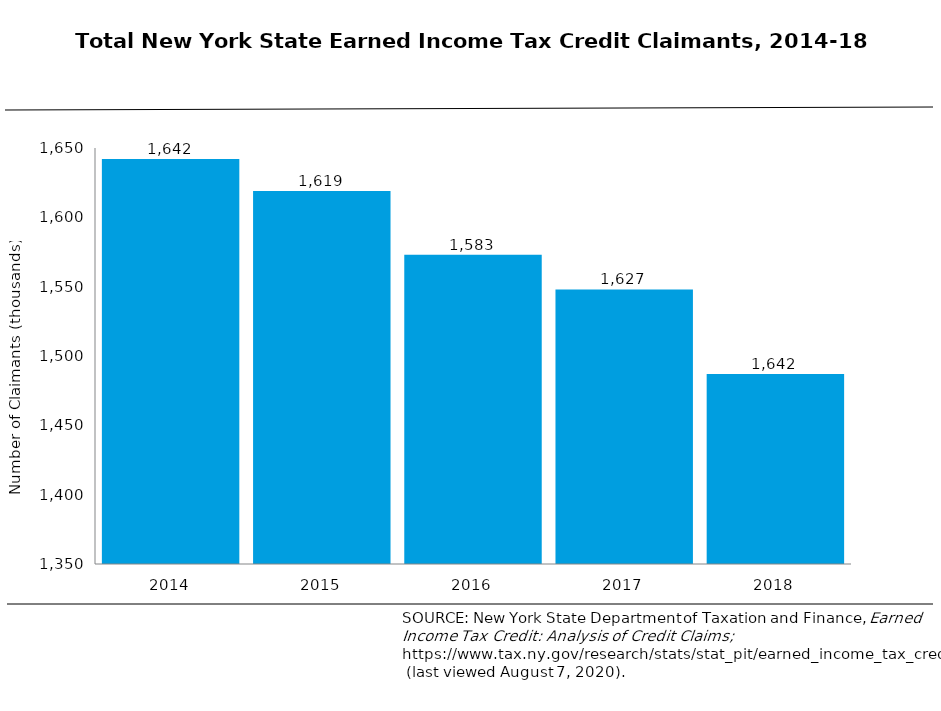
| Category | Column2 |
|---|---|
| 2014 | 1642 |
| 2015 | 1619 |
| 2016 | 1573 |
| 2017 | 1548 |
| 2018 | 1487 |